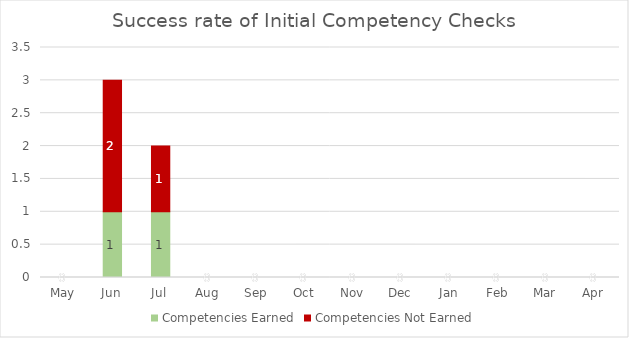
| Category | Competencies Earned | Competencies Not Earned |
|---|---|---|
| May | 0 | 0 |
| Jun | 1 | 2 |
| Jul | 1 | 1 |
| Aug | 0 | 0 |
| Sep | 0 | 0 |
| Oct | 0 | 0 |
| Nov | 0 | 0 |
| Dec | 0 | 0 |
| Jan | 0 | 0 |
| Feb | 0 | 0 |
| Mar | 0 | 0 |
| Apr | 0 | 0 |